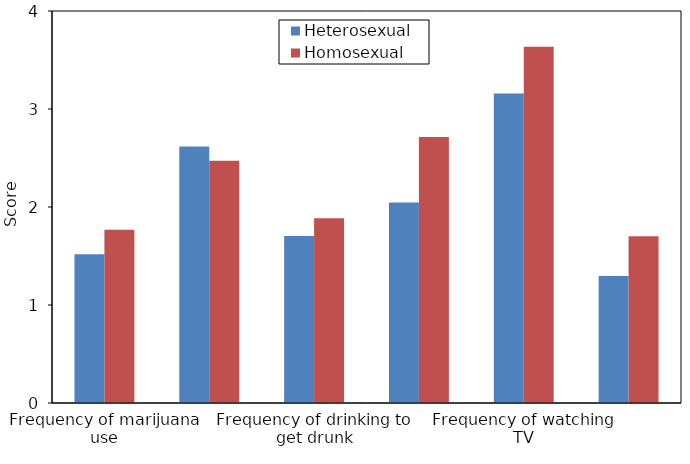
| Category | Heterosexual | Homosexual |
|---|---|---|
| Frequency of marijuana use | 1.517 | 1.769 |
| Frequency of alcohol use | 2.616 | 2.472 |
| Frequency of drinking to get drunk | 1.703 | 1.884 |
| Frequency of smoking | 2.045 | 2.714 |
| Frequency of watching TV | 3.157 | 3.635 |
| Frequency of having been arrested | 1.296 | 1.702 |